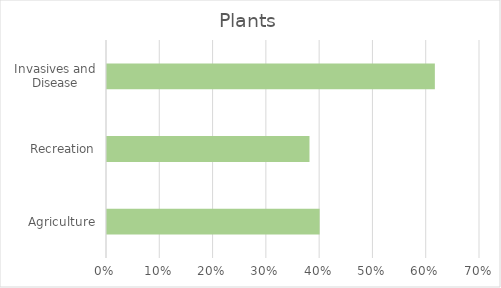
| Category | Series 0 |
|---|---|
| Agriculture | 0.399 |
| Recreation | 0.38 |
| Invasives and Disease | 0.615 |